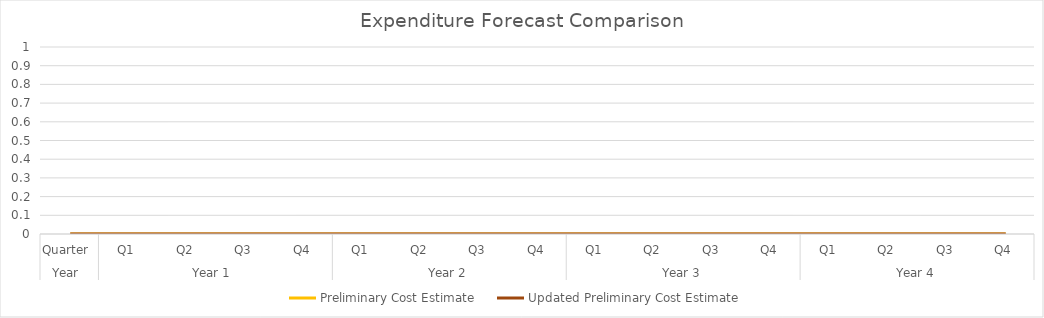
| Category | Preliminary Cost Estimate | Updated Preliminary Cost Estimate |
|---|---|---|
| 0 | 0 | 0 |
| 1 | 0 | 0 |
| 2 | 0 | 0 |
| 3 | 0 | 0 |
| 4 | 0 | 0 |
| 5 | 0 | 0 |
| 6 | 0 | 0 |
| 7 | 0 | 0 |
| 8 | 0 | 0 |
| 9 | 0 | 0 |
| 10 | 0 | 0 |
| 11 | 0 | 0 |
| 12 | 0 | 0 |
| 13 | 0 | 0 |
| 14 | 0 | 0 |
| 15 | 0 | 0 |
| 16 | 0 | 0 |